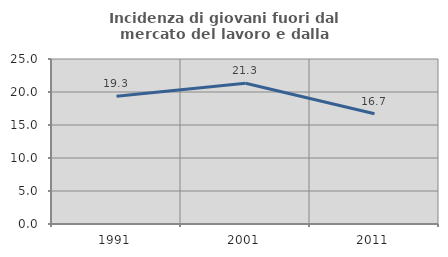
| Category | Incidenza di giovani fuori dal mercato del lavoro e dalla formazione  |
|---|---|
| 1991.0 | 19.343 |
| 2001.0 | 21.315 |
| 2011.0 | 16.703 |